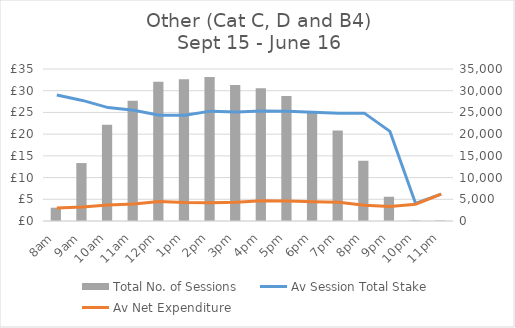
| Category | Total No. of Sessions |
|---|---|
| 8am | 3059 |
| 9am | 13340 |
| 10am | 22178 |
| 11am | 27692 |
| 12pm | 32088 |
| 1pm | 32631 |
| 2pm | 33160 |
| 3pm | 31292 |
| 4pm | 30555 |
| 5pm | 28794 |
| 6pm | 25022 |
| 7pm | 20834 |
| 8pm | 13867 |
| 9pm | 5582 |
| 10pm | 138 |
| 11pm | 122 |